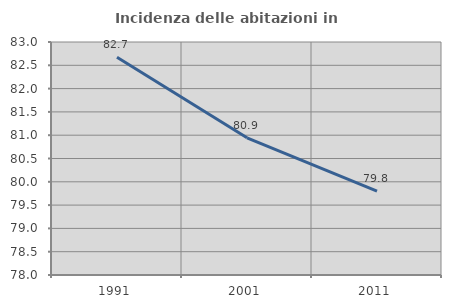
| Category | Incidenza delle abitazioni in proprietà  |
|---|---|
| 1991.0 | 82.674 |
| 2001.0 | 80.944 |
| 2011.0 | 79.8 |